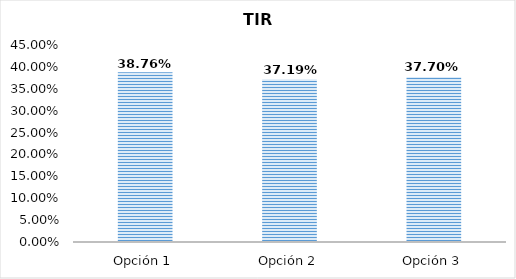
| Category | TIR [%] |
|---|---|
| Opción 1 | 0.388 |
| Opción 2 | 0.372 |
| Opción 3 | 0.377 |